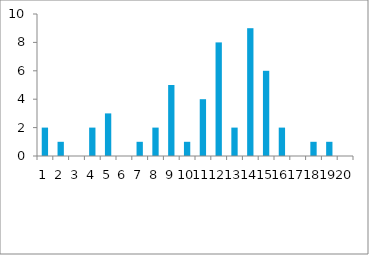
| Category | n |
|---|---|
| 0 | 2 |
| 1 | 1 |
| 2 | 0 |
| 3 | 2 |
| 4 | 3 |
| 5 | 0 |
| 6 | 1 |
| 7 | 2 |
| 8 | 5 |
| 9 | 1 |
| 10 | 4 |
| 11 | 8 |
| 12 | 2 |
| 13 | 9 |
| 14 | 6 |
| 15 | 2 |
| 16 | 0 |
| 17 | 1 |
| 18 | 1 |
| 19 | 0 |